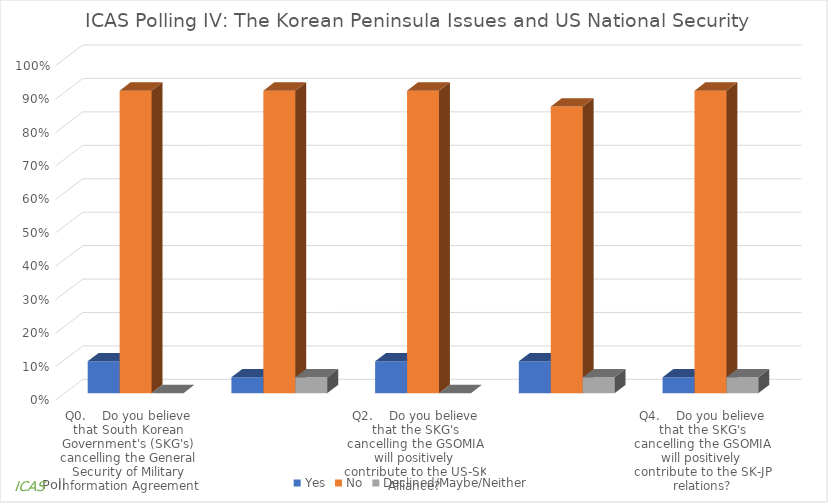
| Category | Yes | No | Declined/Maybe/Neither |
|---|---|---|---|
| Q0.    Do you believe that South Korean Government's (SKG's) cancelling the General Security of Military Information Agreement (GSOMIA) with the Government of Japan (JPG) will positively contribute to the security of South Korea (SK) vis-a-vis North Korea  | 0.095 | 0.905 | 0 |
| Q1.    Do you believe that the SKG's cancelling the GSOMIA will positively contribute to the economy of SK? | 0.048 | 0.905 | 0.048 |
| Q2.    Do you believe that the SKG's cancelling the GSOMIA will positively contribute to the US-SK Alliance? | 0.095 | 0.905 | 0 |
| Q3.    Do you believe that the SKG's cancelling the GSOMIA will positively contribute to the trilateral security architecture of the US-SK-JP? | 0.095 | 0.857 | 0.048 |
| Q4.    Do you believe that the SKG's cancelling the GSOMIA will positively contribute to the SK-JP relations? | 0.048 | 0.905 | 0.048 |